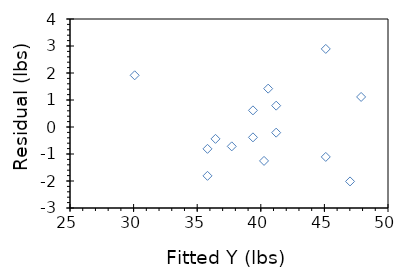
| Category | Series 0 |
|---|---|
| 36.43926380368099 | -0.439 |
| 41.20920245398773 | -0.209 |
| 40.255214723926386 | -1.255 |
| 41.20920245398773 | 0.791 |
| 47.887116564417184 | 1.113 |
| 39.384049079754604 | 0.616 |
| 45.1079754601227 | 2.892 |
| 39.384049079754604 | -0.384 |
| 47.0159509202454 | -2.016 |
| 45.1079754601227 | -1.108 |
| 35.80920245398773 | -0.809 |
| 37.71717791411043 | -0.717 |
| 40.579141104294486 | 1.421 |
| 35.80920245398773 | -1.809 |
| 30.08527607361964 | 1.915 |